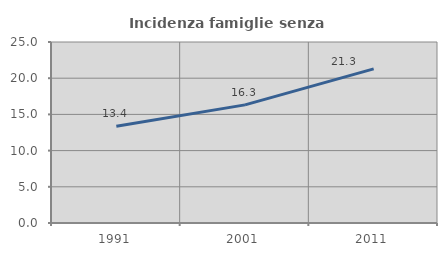
| Category | Incidenza famiglie senza nuclei |
|---|---|
| 1991.0 | 13.367 |
| 2001.0 | 16.313 |
| 2011.0 | 21.289 |